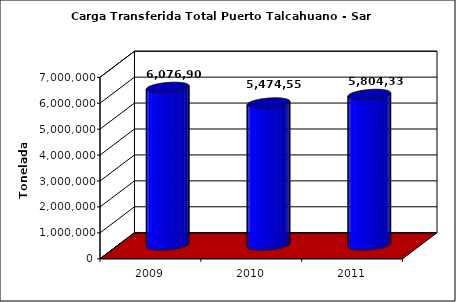
| Category | Series 0 |
|---|---|
| 2009.0 | 6076902 |
| 2010.0 | 5474555.384 |
| 2011.0 | 5804331.43 |